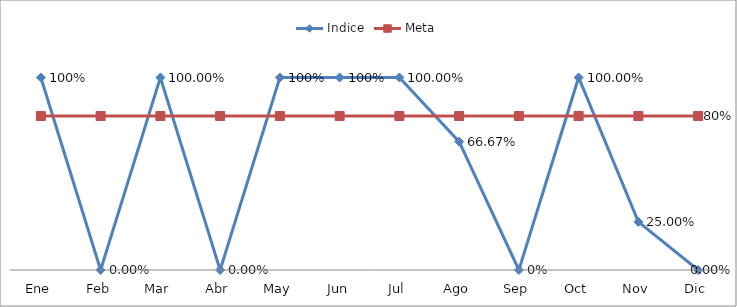
| Category | Indice | Meta |
|---|---|---|
| Ene | 1 | 0.8 |
| Feb | 0 | 0.8 |
| Mar | 1 | 0.8 |
| Abr | 0 | 0.8 |
| May | 1 | 0.8 |
| Jun | 1 | 0.8 |
| Jul | 1 | 0.8 |
| Ago | 0.667 | 0.8 |
| Sep | 0 | 0.8 |
| Oct | 1 | 0.8 |
| Nov | 0.25 | 0.8 |
| Dic | 0 | 0.8 |